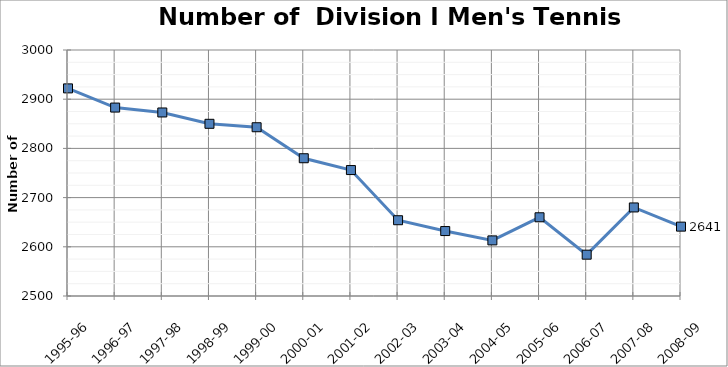
| Category | Men |
|---|---|
| 1995-96 | 2922 |
| 1996-97 | 2883 |
| 1997-98 | 2873 |
| 1998-99 | 2850 |
| 1999-00 | 2843 |
| 2000-01 | 2780 |
| 2001-02 | 2756 |
| 2002-03 | 2654 |
| 2003-04 | 2632 |
| 2004-05 | 2613 |
| 2005-06 | 2660 |
| 2006-07 | 2584 |
| 2007-08 | 2680 |
| 2008-09 | 2641 |